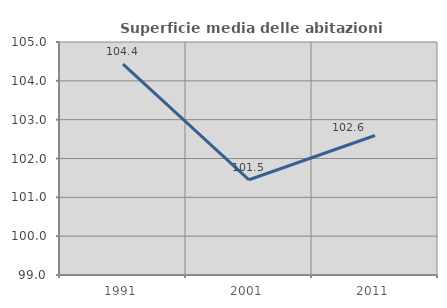
| Category | Superficie media delle abitazioni occupate |
|---|---|
| 1991.0 | 104.43 |
| 2001.0 | 101.452 |
| 2011.0 | 102.592 |